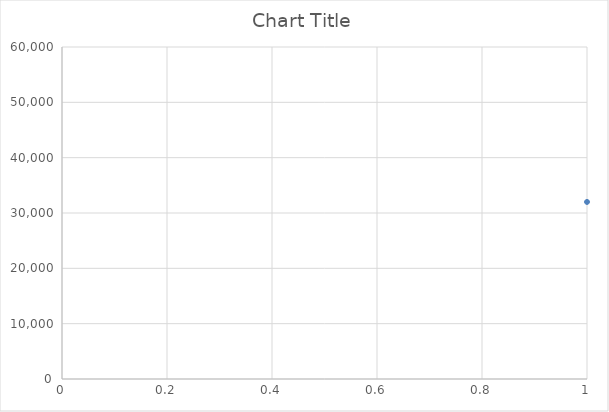
| Category | Series 0 |
|---|---|
| 0 | 32000 |
| 1 | 32200 |
| 2 | 30000 |
| 3 | 32600 |
| 4 | 32800 |
| 5 | 30800 |
| 6 | 41500 |
| 7 | 41000 |
| 8 | 41500 |
| 9 | 41000 |
| 10 | 50500 |
| 11 | 31800 |
| 12 | 31400 |
| 13 | 31000 |
| 14 | 31800 |
| 15 | 42000 |
| 16 | 43500 |
| 17 | 31600 |
| 18 | 31600 |
| 19 | 31000 |
| 20 | 31600 |
| 21 | 31800 |
| 22 | 31400 |
| 23 | 31000 |
| 24 | 31800 |
| 25 | 42500 |
| 26 | 44500 |
| 27 | 42000 |
| 28 | 43500 |
| 29 | 10000 |
| 30 | 12000 |
| 31 | 9800 |
| 32 | 11800 |
| 33 | 24000 |
| 34 | 9800 |
| 35 | 9800 |
| 36 | 12000 |
| 37 | 18000 |
| 38 | 25000 |
| 39 | 23600 |
| 40 | 24000 |
| 41 | 23800 |
| 42 | 24000 |
| 43 | 24000 |
| 44 | 24000 |
| 45 | 24000 |
| 46 | 23800 |
| 47 | 23800 |
| 48 | 23600 |
| 49 | 23200 |
| 50 | 23200 |
| 51 | 23000 |
| 52 | 22800 |
| 53 | 22800 |
| 54 | 22600 |
| 55 | 24000 |
| 56 | 24000 |
| 57 | 24000 |
| 58 | 24000 |
| 59 | 23400 |
| 60 | 23400 |
| 61 | 23600 |
| 62 | 23400 |
| 63 | 23400 |
| 64 | 23200 |
| 65 | 23200 |
| 66 | 23400 |
| 67 | 24000 |
| 68 | 23800 |
| 69 | 23800 |
| 70 | 23800 |
| 71 | 23800 |
| 72 | 23600 |
| 73 | 23400 |
| 74 | 23400 |
| 75 | 23200 |
| 76 | 23600 |
| 77 | 23400 |
| 78 | 23400 |
| 79 | 23200 |
| 80 | 23000 |
| 81 | 23000 |
| 82 | 23000 |
| 83 | 23000 |
| 84 | 23000 |
| 85 | 23000 |
| 86 | 23000 |
| 87 | 23000 |
| 88 | 22800 |
| 89 | 22800 |
| 90 | 22800 |
| 91 | 22800 |
| 92 | 22800 |
| 93 | 22800 |
| 94 | 23000 |
| 95 | 23000 |
| 96 | 23000 |
| 97 | 23000 |
| 98 | 23000 |
| 99 | 23000 |
| 100 | 23400 |
| 101 | 23400 |
| 102 | 23400 |
| 103 | 23400 |
| 104 | 23200 |
| 105 | 23200 |
| 106 | 23200 |
| 107 | 23000 |
| 108 | 23000 |
| 109 | 23400 |
| 110 | 23200 |
| 111 | 23200 |
| 112 | 23200 |
| 113 | 23200 |
| 114 | 23200 |
| 115 | 23200 |
| 116 | 23200 |
| 117 | 23000 |
| 118 | 23200 |
| 119 | 23000 |
| 120 | 23000 |
| 121 | 23200 |
| 122 | 23200 |
| 123 | 33400 |
| 124 | 35404 |
| 125 | 35738 |
| 126 | 33400 |
| 127 | 35000 |
| 128 | 33600 |
| 129 | 33200 |
| 130 | 33000 |
| 131 | 32800 |
| 132 | 34200 |
| 133 | 34000 |
| 134 | 33600 |
| 135 | 35200 |
| 136 | 34800 |
| 137 | 34600 |
| 138 | 33800 |
| 139 | 33600 |
| 140 | 33800 |
| 141 | 33600 |
| 142 | 33400 |
| 143 | 34000 |
| 144 | 34200 |
| 145 | 34000 |
| 146 | 33800 |
| 147 | 34000 |
| 148 | 34000 |
| 149 | 33800 |
| 150 | 34000 |
| 151 | 34000 |
| 152 | 33600 |
| 153 | 33600 |
| 154 | 33600 |
| 155 | 32800 |
| 156 | 33600 |
| 157 | 33600 |
| 158 | 33200 |
| 159 | 33200 |
| 160 | 33200 |
| 161 | 33200 |
| 162 | 33200 |
| 163 | 33200 |
| 164 | 34200 |
| 165 | 34200 |
| 166 | 33800 |
| 167 | 33800 |
| 168 | 33800 |
| 169 | 34000 |
| 170 | 33800 |
| 171 | 33800 |
| 172 | 33800 |
| 173 | 33800 |
| 174 | 33800 |
| 175 | 34000 |
| 176 | 34000 |
| 177 | 34000 |
| 178 | 34000 |
| 179 | 33800 |
| 180 | 33800 |
| 181 | 33800 |
| 182 | 33800 |
| 183 | 33800 |
| 184 | 33800 |
| 185 | 33800 |
| 186 | 45500 |
| 187 | 46500 |
| 188 | 46000 |
| 189 | 45500 |
| 190 | 45500 |
| 191 | 46000 |
| 192 | 46000 |
| 193 | 46000 |
| 194 | 55500 |
| 195 | 10000 |
| 196 | 12000 |
| 197 | 55500 |
| 198 | 33400 |
| 199 | 45500 |
| 200 | 23600 |
| 201 | 24000 |
| 202 | 11800 |
| 203 | 10900 |
| 204 | 18000 |
| 205 | 18000 |
| 206 | 18000 |
| 207 | 19000 |
| 208 | 19000 |
| 209 | 36000 |
| 210 | 36000 |
| 211 | 48000 |
| 212 | 48000 |
| 213 | 23000 |
| 214 | 23000 |
| 215 | 28000 |
| 216 | 28000 |
| 217 | 23600 |
| 218 | 24000 |
| 219 | 23800 |
| 220 | 24000 |
| 221 | 24000 |
| 222 | 24000 |
| 223 | 24000 |
| 224 | 23800 |
| 225 | 23800 |
| 226 | 23600 |
| 227 | 23200 |
| 228 | 23200 |
| 229 | 23000 |
| 230 | 22800 |
| 231 | 22800 |
| 232 | 22600 |
| 233 | 24000 |
| 234 | 24000 |
| 235 | 24000 |
| 236 | 24000 |
| 237 | 23400 |
| 238 | 23400 |
| 239 | 23600 |
| 240 | 23400 |
| 241 | 23400 |
| 242 | 23200 |
| 243 | 23200 |
| 244 | 23400 |
| 245 | 24000 |
| 246 | 23800 |
| 247 | 23800 |
| 248 | 23800 |
| 249 | 23800 |
| 250 | 23600 |
| 251 | 23400 |
| 252 | 23400 |
| 253 | 23200 |
| 254 | 23600 |
| 255 | 23400 |
| 256 | 23400 |
| 257 | 23200 |
| 258 | 23000 |
| 259 | 23000 |
| 260 | 23000 |
| 261 | 23000 |
| 262 | 23000 |
| 263 | 23000 |
| 264 | 23000 |
| 265 | 23000 |
| 266 | 22800 |
| 267 | 22800 |
| 268 | 22800 |
| 269 | 22800 |
| 270 | 22800 |
| 271 | 22800 |
| 272 | 23000 |
| 273 | 23000 |
| 274 | 23000 |
| 275 | 23000 |
| 276 | 23000 |
| 277 | 23000 |
| 278 | 23400 |
| 279 | 23400 |
| 280 | 23400 |
| 281 | 23400 |
| 282 | 23200 |
| 283 | 23200 |
| 284 | 23200 |
| 285 | 23000 |
| 286 | 23000 |
| 287 | 23400 |
| 288 | 23200 |
| 289 | 23200 |
| 290 | 23200 |
| 291 | 23200 |
| 292 | 23200 |
| 293 | 23200 |
| 294 | 23200 |
| 295 | 23000 |
| 296 | 23200 |
| 297 | 23000 |
| 298 | 23000 |
| 299 | 23200 |
| 300 | 23200 |
| 301 | 23200 |
| 302 | 33400 |
| 303 | 35404 |
| 304 | 35738 |
| 305 | 33400 |
| 306 | 35000 |
| 307 | 33600 |
| 308 | 33200 |
| 309 | 33000 |
| 310 | 32800 |
| 311 | 34200 |
| 312 | 34000 |
| 313 | 33600 |
| 314 | 35200 |
| 315 | 34800 |
| 316 | 34600 |
| 317 | 33800 |
| 318 | 33600 |
| 319 | 33800 |
| 320 | 33600 |
| 321 | 33400 |
| 322 | 34000 |
| 323 | 34200 |
| 324 | 34000 |
| 325 | 33800 |
| 326 | 34000 |
| 327 | 34000 |
| 328 | 33800 |
| 329 | 34000 |
| 330 | 34000 |
| 331 | 33600 |
| 332 | 33600 |
| 333 | 33600 |
| 334 | 32800 |
| 335 | 33600 |
| 336 | 33600 |
| 337 | 33200 |
| 338 | 33200 |
| 339 | 33200 |
| 340 | 33200 |
| 341 | 33200 |
| 342 | 33200 |
| 343 | 34200 |
| 344 | 34200 |
| 345 | 33800 |
| 346 | 33800 |
| 347 | 33800 |
| 348 | 34000 |
| 349 | 33800 |
| 350 | 33800 |
| 351 | 33800 |
| 352 | 33800 |
| 353 | 33800 |
| 354 | 34000 |
| 355 | 34000 |
| 356 | 34000 |
| 357 | 34000 |
| 358 | 33800 |
| 359 | 33800 |
| 360 | 33800 |
| 361 | 33800 |
| 362 | 33800 |
| 363 | 33800 |
| 364 | 33800 |
| 365 | 45500 |
| 366 | 46500 |
| 367 | 46000 |
| 368 | 45500 |
| 369 | 45500 |
| 370 | 46000 |
| 371 | 46000 |
| 372 | 46000 |
| 373 | 55500 |
| 374 | 19000 |
| 375 | 24000 |
| 376 | 18000 |
| 377 | 10000 |
| 378 | 12000 |
| 379 | 9000 |
| 380 | 13000 |
| 381 | 19000 |
| 382 | 10900 |
| 383 | 11800 |
| 384 | 24000 |
| 385 | 18000 |
| 386 | 10000 |
| 387 | 12000 |
| 388 | 9800 |
| 389 | 11800 |
| 390 | 24000 |
| 391 | 12000 |
| 392 | 16000 |
| 393 | 18000 |
| 394 | 12000 |
| 395 | 14400 |
| 396 | 18000 |
| 397 | 21600 |
| 398 | 25400 |
| 399 | 18900 |
| 400 | 24000 |
| 401 | 18295 |
| 402 | 18056 |
| 403 | 13679 |
| 404 | 10089 |
| 405 | 10942 |
| 406 | 18940 |
| 407 | 24000 |
| 408 | 10000 |
| 409 | 13500 |
| 410 | 16200 |
| 411 | 21600 |
| 412 | 23600 |
| 413 | 35000 |
| 414 | 45500 |
| 415 | 50000 |
| 416 | 23400 |
| 417 | 10000 |
| 418 | 12000 |
| 419 | 9800 |
| 420 | 11800 |
| 421 | 24000 |
| 422 | 11000 |
| 423 | 13000 |
| 424 | 8806.37 |